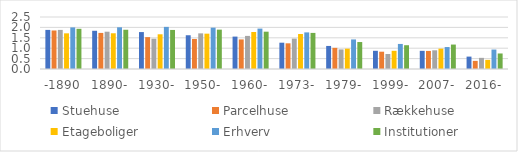
| Category | Stuehuse | Parcelhuse | Rækkehuse | Etageboliger | Erhverv | Institutioner |
|---|---|---|---|---|---|---|
| -1890 | 1.88 | 1.852 | 1.879 | 1.715 | 2 | 1.932 |
| 1890- | 1.838 | 1.735 | 1.793 | 1.718 | 2.005 | 1.887 |
| 1930- | 1.775 | 1.532 | 1.456 | 1.669 | 2.025 | 1.877 |
| 1950- | 1.623 | 1.445 | 1.714 | 1.699 | 1.988 | 1.892 |
| 1960- | 1.558 | 1.422 | 1.591 | 1.778 | 1.943 | 1.794 |
| 1973- | 1.265 | 1.235 | 1.461 | 1.682 | 1.76 | 1.735 |
| 1979- | 1.108 | 1.017 | 0.941 | 0.978 | 1.421 | 1.297 |
| 1999- | 0.875 | 0.832 | 0.722 | 0.875 | 1.204 | 1.143 |
| 2007- | 0.873 | 0.869 | 0.899 | 0.979 | 1.055 | 1.175 |
| 2016- | 0.596 | 0.391 | 0.536 | 0.439 | 0.935 | 0.746 |